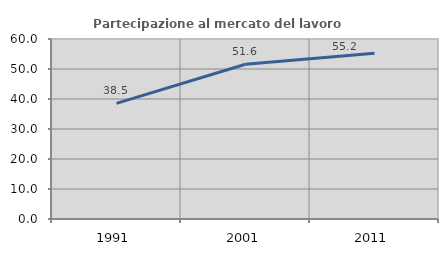
| Category | Partecipazione al mercato del lavoro  femminile |
|---|---|
| 1991.0 | 38.52 |
| 2001.0 | 51.584 |
| 2011.0 | 55.234 |